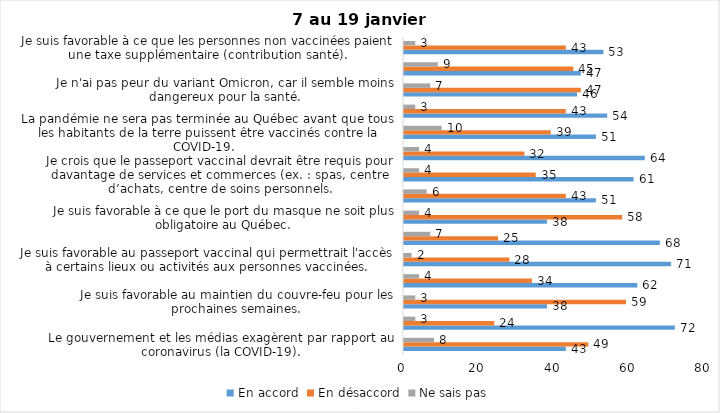
| Category | En accord | En désaccord | Ne sais pas |
|---|---|---|---|
| Le gouvernement et les médias exagèrent par rapport au coronavirus (la COVID-19). | 43 | 49 | 8 |
| J’ai peur que le système de santé soit débordé par les cas de COVID-19. | 72 | 24 | 3 |
| Je suis favorable au maintien du couvre-feu pour les prochaines semaines. | 38 | 59 | 3 |
| Je suis inquiet/inquiète que le nombre de cas augmente en raison des nouveaux variants du virus de la COVID-19. | 62 | 34 | 4 |
| Je suis favorable au passeport vaccinal qui permettrait l'accès à certains lieux ou activités aux personnes vaccinées. | 71 | 28 | 2 |
| Je suis confiant que la vaccination protège efficacement contre les variants de la COVID-19 | 68 | 25 | 7 |
| Je suis favorable à ce que le port du masque ne soit plus obligatoire au Québec. | 38 | 58 | 4 |
| J'ai peur que la reprise des cours en présentiel dans les écoles primaires et secondaires génère une augmentation des cas de COVID-19 | 51 | 43 | 6 |
| Je crois que le passeport vaccinal devrait être requis pour davantage de services et commerces (ex. : spas, centre d’achats, centre de soins personnels. | 61 | 35 | 4 |
| Les personnes non adéquatement vaccinées contre la COVID-19 sont responsables des nouveaux cas et hospitalisations et contribuent à la prolongation de la pandémie au Québec. | 64 | 32 | 4 |
| La pandémie ne sera pas terminée au Québec avant que tous les habitants de la terre puissent être vaccinés contre la COVID-19.   | 51 | 39 | 10 |
| Je suis inconfortable d’être en contact avec une personne non vaccinée contre la COVID-19 | 54 | 43 | 3 |
| Je n'ai pas peur du variant Omicron, car il semble moins dangereux pour la santé. | 46 | 47 | 7 |
| La vaccination obligatoire contre la COVID-19 mettrait fin à la pandémie. | 47 | 45 | 9 |
| Je suis favorable à ce que les personnes non vaccinées paient une taxe supplémentaire (contribution santé). | 53 | 43 | 3 |